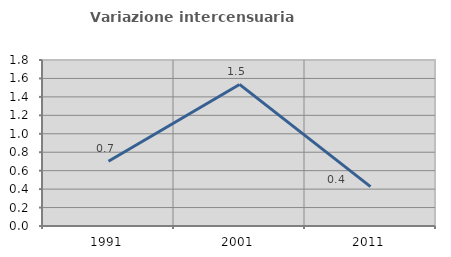
| Category | Variazione intercensuaria annua |
|---|---|
| 1991.0 | 0.701 |
| 2001.0 | 1.535 |
| 2011.0 | 0.427 |